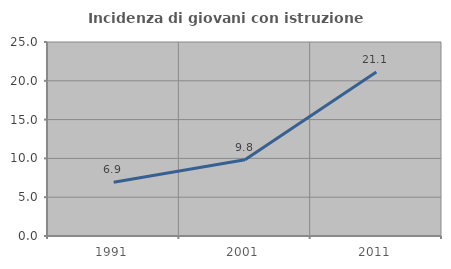
| Category | Incidenza di giovani con istruzione universitaria |
|---|---|
| 1991.0 | 6.921 |
| 2001.0 | 9.832 |
| 2011.0 | 21.12 |